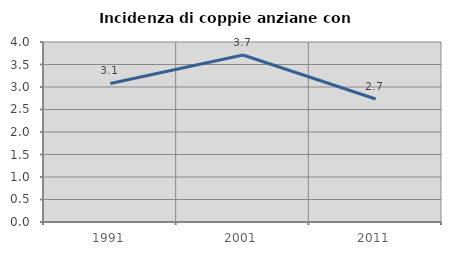
| Category | Incidenza di coppie anziane con figli |
|---|---|
| 1991.0 | 3.078 |
| 2001.0 | 3.712 |
| 2011.0 | 2.733 |